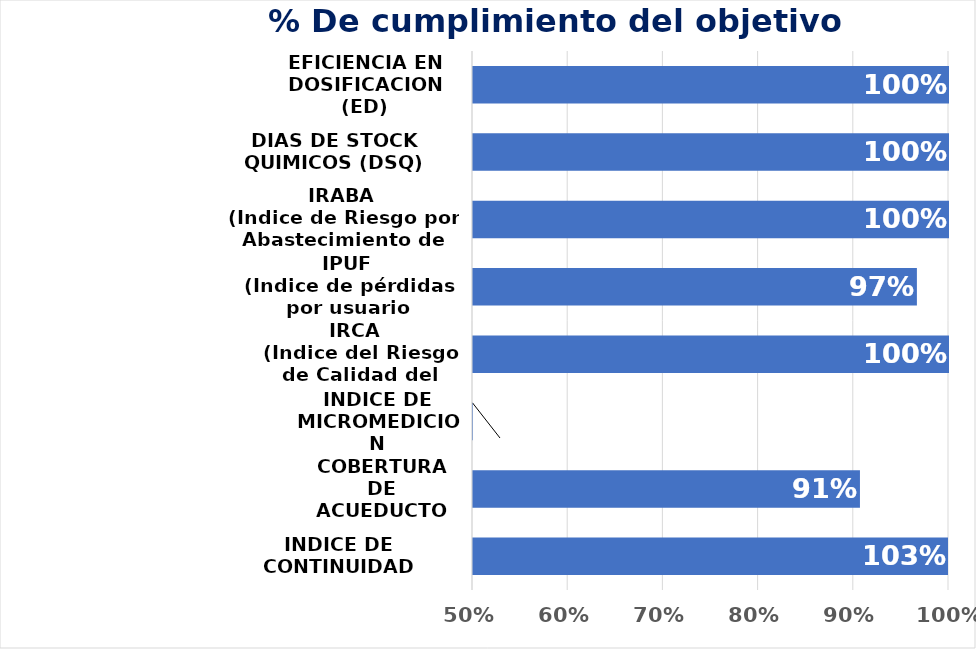
| Category | Series 0 |
|---|---|
| INDICE DE CONTINUIDAD | 1.029 |
| COBERTURA DE ACUEDUCTO | 0.906 |
| INDICE DE MICROMEDICION | 0 |
| IRCA 
(Indice del Riesgo de Calidad del Agua) | 1 |
| IPUF
(Indice de pérdidas por usuario facturado) | 0.966 |
|  IRABA 
(Indice de Riesgo por Abastecimiento de Agua Potable) | 1 |
| DIAS DE STOCK QUIMICOS (DSQ) | 1 |
| EFICIENCIA EN DOSIFICACION (ED) | 1 |